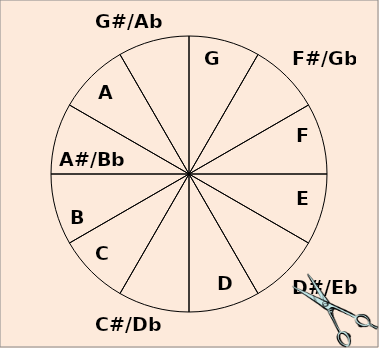
| Category | Series 0 |
|---|---|
| G | 1 |
| F#/Gb | 1 |
| F | 1 |
| E | 1 |
| D#/Eb | 1 |
| D | 1 |
| C#/Db | 1 |
| C | 1 |
| B | 1 |
| A#/Bb | 1 |
| A | 1 |
| G#/Ab | 1 |